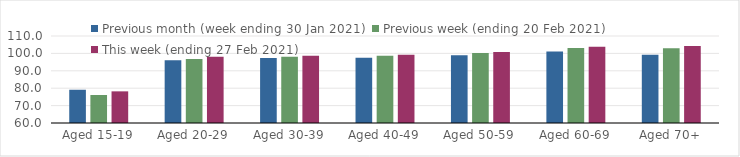
| Category | Previous month (week ending 30 Jan 2021) | Previous week (ending 20 Feb 2021) | This week (ending 27 Feb 2021) |
|---|---|---|---|
| Aged 15-19 | 79.11 | 76.09 | 78.19 |
| Aged 20-29 | 96.03 | 96.83 | 98.01 |
| Aged 30-39 | 97.31 | 98.01 | 98.64 |
| Aged 40-49 | 97.54 | 98.59 | 99.18 |
| Aged 50-59 | 98.9 | 100.24 | 100.85 |
| Aged 60-69 | 101.06 | 103.14 | 103.88 |
| Aged 70+ | 99.21 | 102.99 | 104.25 |